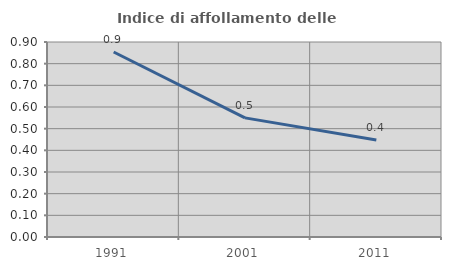
| Category | Indice di affollamento delle abitazioni  |
|---|---|
| 1991.0 | 0.854 |
| 2001.0 | 0.55 |
| 2011.0 | 0.447 |